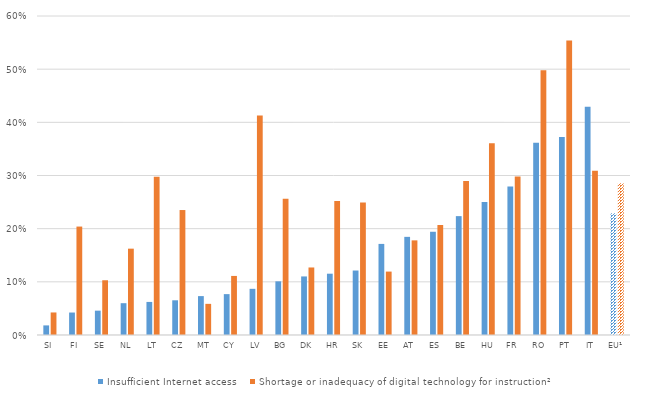
| Category | Insufficient Internet access   | Shortage or inadequacy of digital technology for instruction² |
|---|---|---|
| SI | 0.018 | 0.042 |
| FI | 0.042 | 0.204 |
| SE | 0.046 | 0.103 |
| NL | 0.06 | 0.162 |
| LT | 0.062 | 0.298 |
| CZ | 0.065 | 0.235 |
| MT | 0.073 | 0.059 |
| CY | 0.077 | 0.111 |
| LV | 0.087 | 0.413 |
| BG | 0.101 | 0.256 |
| DK | 0.11 | 0.127 |
| HR | 0.115 | 0.252 |
| SK | 0.121 | 0.249 |
| EE | 0.171 | 0.119 |
| AT | 0.185 | 0.178 |
| ES | 0.194 | 0.207 |
| BE | 0.224 | 0.29 |
| HU | 0.25 | 0.361 |
| FR | 0.279 | 0.298 |
| RO | 0.362 | 0.498 |
| PT | 0.372 | 0.554 |
| IT | 0.429 | 0.309 |
| EU¹ | 0.229 | 0.285 |